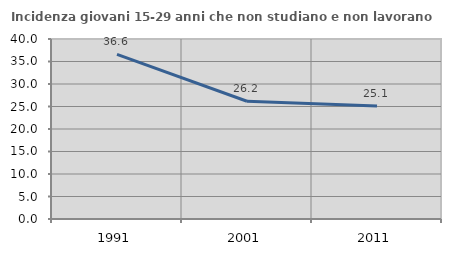
| Category | Incidenza giovani 15-29 anni che non studiano e non lavorano  |
|---|---|
| 1991.0 | 36.585 |
| 2001.0 | 26.159 |
| 2011.0 | 25.134 |